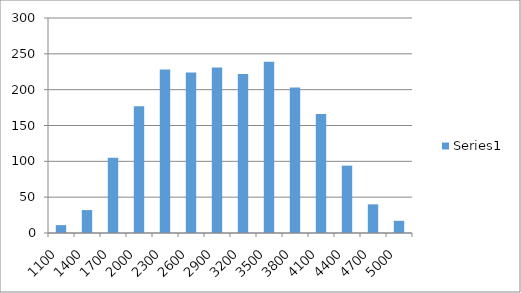
| Category | Series 0 |
|---|---|
| 1100.0 | 11 |
| 1400.0 | 32 |
| 1700.0 | 105 |
| 2000.0 | 177 |
| 2300.0 | 228 |
| 2600.0 | 224 |
| 2900.0 | 231 |
| 3200.0 | 222 |
| 3500.0 | 239 |
| 3800.0 | 203 |
| 4100.0 | 166 |
| 4400.0 | 94 |
| 4700.0 | 40 |
| 5000.0 | 17 |